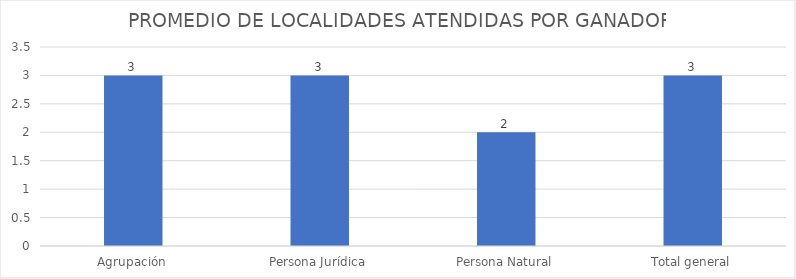
| Category | VALOR PROMEDIO |
|---|---|
| Agrupación | 3 |
| Persona Jurídica | 3 |
| Persona Natural | 2 |
| Total general | 3 |